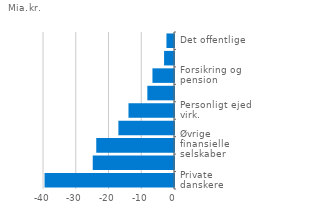
| Category | Tab |
|---|---|
| Private danskere | -39522100432.804 |
| Investeringsfonde | -24807633709.556 |
| Øvrige finansielle selskaber | -23736978810.573 |
| Udland | -16979622644.259 |
| Personligt ejede virk. | -13896240019.083 |
| Ikke-finansielle selskaber | -8136585902.634 |
| Forsikring og pension | -6580384505.613 |
| NPISH | -3026102563.128 |
| Det offentlige | -2304589147.127 |